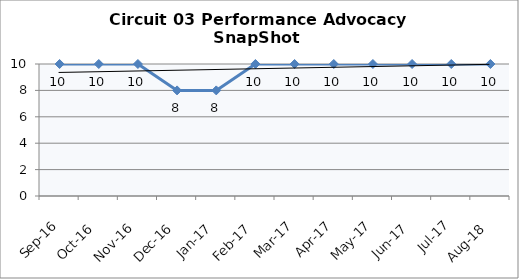
| Category | Circuit 03 |
|---|---|
| Sep-16 | 10 |
| Oct-16 | 10 |
| Nov-16 | 10 |
| Dec-16 | 8 |
| Jan-17 | 8 |
| Feb-17 | 10 |
| Mar-17 | 10 |
| Apr-17 | 10 |
| May-17 | 10 |
| Jun-17 | 10 |
| Jul-17 | 10 |
| Aug-18 | 10 |